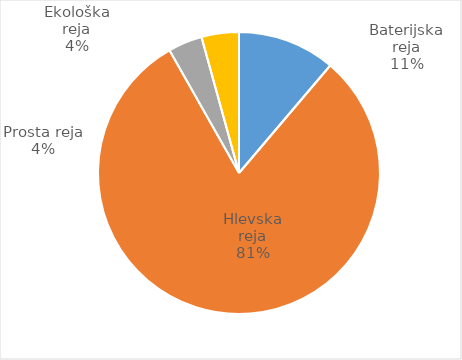
| Category | Število kosov jajc |
|---|---|
| Baterijska reja | 276030 |
| Hlevska reja | 1986380 |
| Prosta reja | 96558 |
| Ekološka reja | 105642 |